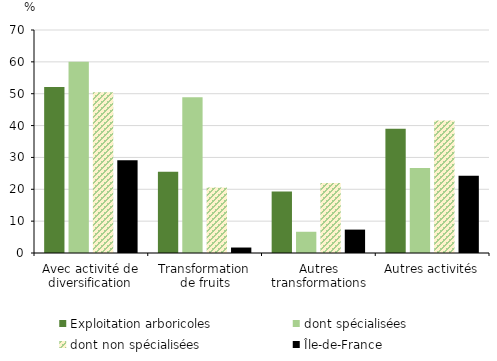
| Category | Exploitation arboricoles | dont spécialisées | dont non spécialisées | Île-de-France |
|---|---|---|---|---|
| Avec activité de diversification | 52.124 | 60 | 50.467 | 29.153 |
| Transformation de fruits | 25.483 | 48.889 | 20.561 | 1.718 |
| Autres transformations | 19.305 | 6.667 | 21.963 | 7.345 |
| Autres activités | 38.996 | 26.667 | 41.589 | 24.249 |